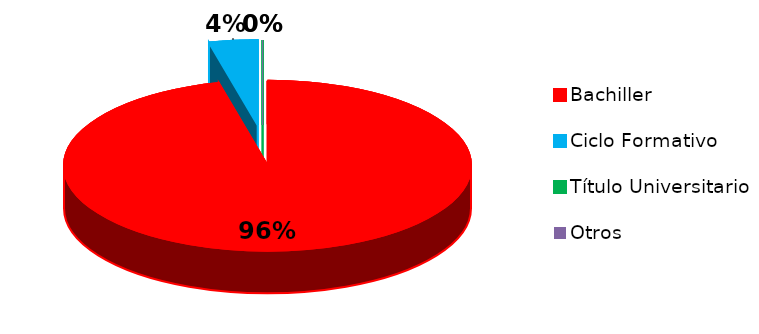
| Category | Series 0 |
|---|---|
| Bachiller | 25 |
| Ciclo Formativo | 1 |
| Título Universitario | 0 |
| Otros | 0 |